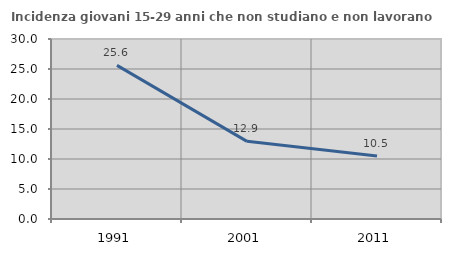
| Category | Incidenza giovani 15-29 anni che non studiano e non lavorano  |
|---|---|
| 1991.0 | 25.598 |
| 2001.0 | 12.939 |
| 2011.0 | 10.505 |